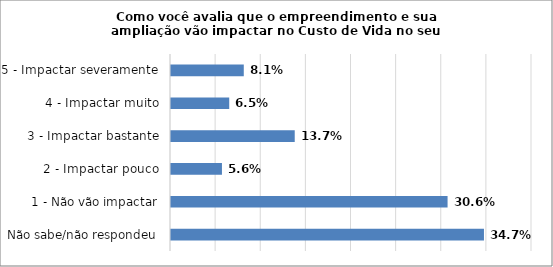
| Category | Series 0 |
|---|---|
| Não sabe/não respondeu | 0.347 |
| 1 - Não vão impactar | 0.306 |
| 2 - Impactar pouco | 0.056 |
| 3 - Impactar bastante | 0.137 |
| 4 - Impactar muito | 0.065 |
| 5 - Impactar severamente | 0.081 |